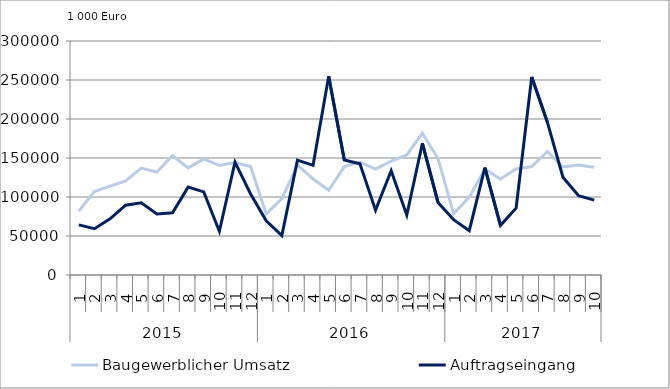
| Category | Baugewerblicher Umsatz | Auftragseingang |
|---|---|---|
| 0 | 81937.361 | 64244.383 |
| 1 | 106908.454 | 59377.677 |
| 2 | 113904.285 | 71953.971 |
| 3 | 120612.446 | 89496.024 |
| 4 | 137142.75 | 92563.213 |
| 5 | 132019.811 | 78131.737 |
| 6 | 153125.961 | 79765.729 |
| 7 | 137370.133 | 112637.987 |
| 8 | 148792.629 | 106572.56 |
| 9 | 140483.911 | 56073.767 |
| 10 | 144146.162 | 144643.688 |
| 11 | 139085.889 | 103931.175 |
| 12 | 78291.738 | 69470.357 |
| 13 | 97863.379 | 50640.033 |
| 14 | 141176.119 | 147206.65 |
| 15 | 123121.297 | 140579.009 |
| 16 | 108561.124 | 254739.334 |
| 17 | 139030.209 | 147481.644 |
| 18 | 144784.416 | 142609.658 |
| 19 | 135870.195 | 83192.156 |
| 20 | 145961.738 | 133594.351 |
| 21 | 153886.826 | 76793.838 |
| 22 | 181740.037 | 168867.568 |
| 23 | 149348.138 | 93011.853 |
| 24 | 78446.78 | 70908.903 |
| 25 | 99841.908 | 56868.408 |
| 26 | 135679.867 | 137790.423 |
| 27 | 123004.403 | 63637.761 |
| 28 | 136010.071 | 85644.63 |
| 29 | 138859.308 | 253791.552 |
| 30 | 158353.879 | 196034.198 |
| 31 | 138510.315 | 125319.873 |
| 32 | 141109.925 | 101690.626 |
| 33 | 138067.098 | 95966.626 |